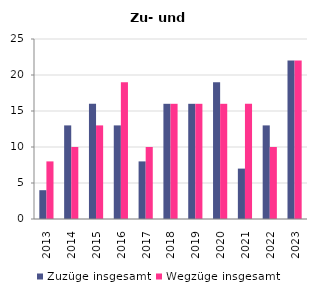
| Category | Zuzüge insgesamt | Wegzüge insgesamt |
|---|---|---|
| 2013.0 | 4 | 8 |
| 2014.0 | 13 | 10 |
| 2015.0 | 16 | 13 |
| 2016.0 | 13 | 19 |
| 2017.0 | 8 | 10 |
| 2018.0 | 16 | 16 |
| 2019.0 | 16 | 16 |
| 2020.0 | 19 | 16 |
| 2021.0 | 7 | 16 |
| 2022.0 | 13 | 10 |
| 2023.0 | 22 | 22 |